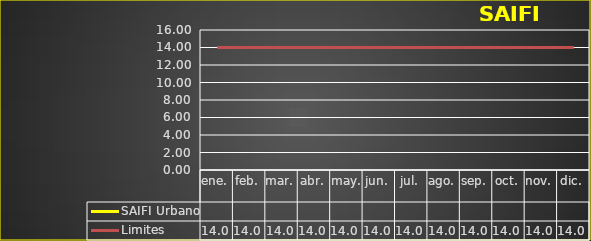
| Category | SAIFI Urbano | Limites |
|---|---|---|
| ene. |  | 14 |
| feb. |  | 14 |
| mar. |  | 14 |
| abr. |  | 14 |
| may. |  | 14 |
| jun. |  | 14 |
| jul. |  | 14 |
| ago. |  | 14 |
| sep. |  | 14 |
| oct. |  | 14 |
| nov. |  | 14 |
| dic. |  | 14 |